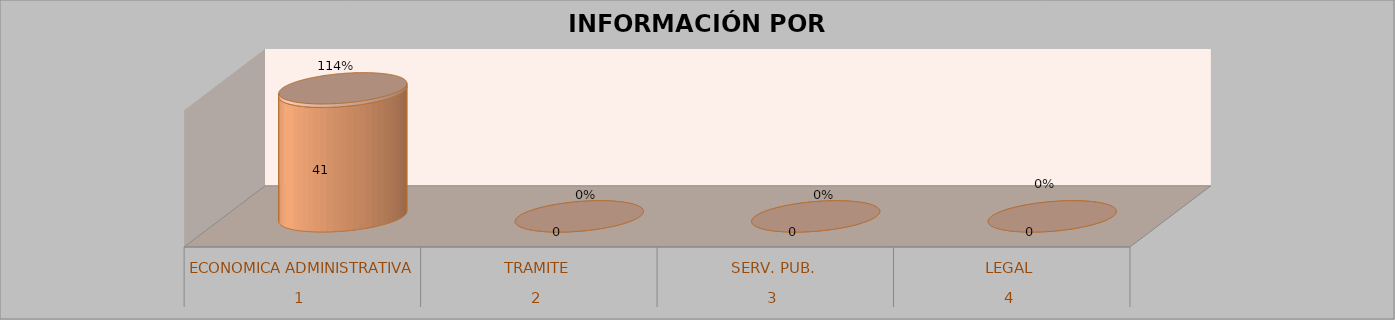
| Category | Series 0 | Series 1 | Series 2 | Series 3 |
|---|---|---|---|---|
| 0 |  |  | 41 | 1.139 |
| 1 |  |  | 0 | 0 |
| 2 |  |  | 0 | 0 |
| 3 |  |  | 0 | 0 |